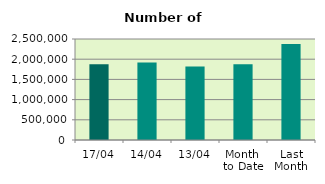
| Category | Series 0 |
|---|---|
| 17/04 | 1877230 |
| 14/04 | 1918534 |
| 13/04 | 1818768 |
| Month 
to Date | 1875862.222 |
| Last
Month | 2375448 |